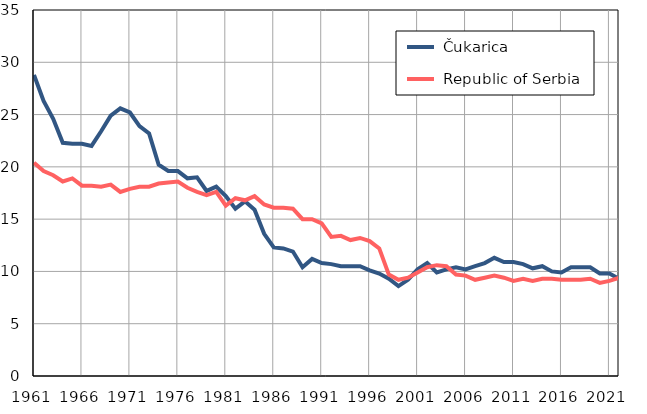
| Category |  Čukarica |  Republic of Serbia |
|---|---|---|
| 1961.0 | 28.8 | 20.4 |
| 1962.0 | 26.3 | 19.6 |
| 1963.0 | 24.6 | 19.2 |
| 1964.0 | 22.3 | 18.6 |
| 1965.0 | 22.2 | 18.9 |
| 1966.0 | 22.2 | 18.2 |
| 1967.0 | 22 | 18.2 |
| 1968.0 | 23.4 | 18.1 |
| 1969.0 | 24.9 | 18.3 |
| 1970.0 | 25.6 | 17.6 |
| 1971.0 | 25.2 | 17.9 |
| 1972.0 | 23.9 | 18.1 |
| 1973.0 | 23.2 | 18.1 |
| 1974.0 | 20.2 | 18.4 |
| 1975.0 | 19.6 | 18.5 |
| 1976.0 | 19.6 | 18.6 |
| 1977.0 | 18.9 | 18 |
| 1978.0 | 19 | 17.6 |
| 1979.0 | 17.7 | 17.3 |
| 1980.0 | 18.1 | 17.6 |
| 1981.0 | 17.2 | 16.3 |
| 1982.0 | 16 | 17 |
| 1983.0 | 16.7 | 16.8 |
| 1984.0 | 15.9 | 17.2 |
| 1985.0 | 13.6 | 16.4 |
| 1986.0 | 12.3 | 16.1 |
| 1987.0 | 12.2 | 16.1 |
| 1988.0 | 11.9 | 16 |
| 1989.0 | 10.4 | 15 |
| 1990.0 | 11.2 | 15 |
| 1991.0 | 10.8 | 14.6 |
| 1992.0 | 10.7 | 13.3 |
| 1993.0 | 10.5 | 13.4 |
| 1994.0 | 10.5 | 13 |
| 1995.0 | 10.5 | 13.2 |
| 1996.0 | 10.1 | 12.9 |
| 1997.0 | 9.8 | 12.2 |
| 1998.0 | 9.3 | 9.7 |
| 1999.0 | 8.6 | 9.2 |
| 2000.0 | 9.2 | 9.4 |
| 2001.0 | 10.2 | 9.9 |
| 2002.0 | 10.8 | 10.4 |
| 2003.0 | 9.9 | 10.6 |
| 2004.0 | 10.2 | 10.5 |
| 2005.0 | 10.4 | 9.7 |
| 2006.0 | 10.2 | 9.6 |
| 2007.0 | 10.5 | 9.2 |
| 2008.0 | 10.8 | 9.4 |
| 2009.0 | 11.3 | 9.6 |
| 2010.0 | 10.9 | 9.4 |
| 2011.0 | 10.9 | 9.1 |
| 2012.0 | 10.7 | 9.3 |
| 2013.0 | 10.3 | 9.1 |
| 2014.0 | 10.5 | 9.3 |
| 2015.0 | 10 | 9.3 |
| 2016.0 | 9.9 | 9.2 |
| 2017.0 | 10.4 | 9.2 |
| 2018.0 | 10.4 | 9.2 |
| 2019.0 | 10.4 | 9.3 |
| 2020.0 | 9.8 | 8.9 |
| 2021.0 | 9.8 | 9.1 |
| 2022.0 | 9.3 | 9.4 |